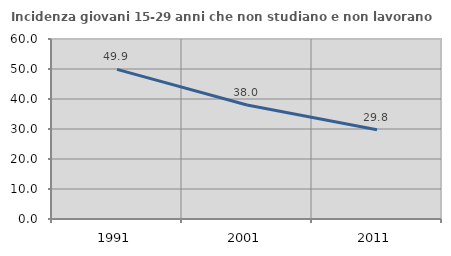
| Category | Incidenza giovani 15-29 anni che non studiano e non lavorano  |
|---|---|
| 1991.0 | 49.869 |
| 2001.0 | 38.017 |
| 2011.0 | 29.762 |